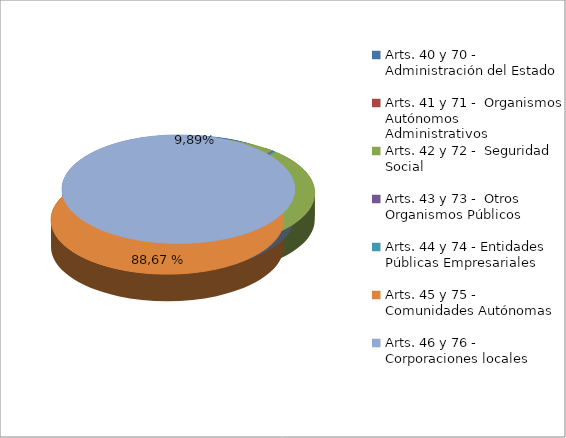
| Category | Series 0 |
|---|---|
| Arts. 40 y 70 - Administración del Estado | 18983323.95 |
| Arts. 41 y 71 -  Organismos Autónomos Administrativos | 1923567.05 |
| Arts. 42 y 72 -  Seguridad Social | -1037.4 |
| Arts. 43 y 73 -  Otros Organismos Públicos  | 449477.53 |
| Arts. 44 y 74 - Entidades Públicas Empresariales | 397249.89 |
| Arts. 45 y 75 - Comunidades Autónomas | 170159699.86 |
| Arts. 46 y 76 - Corporaciones locales | -9378.34 |